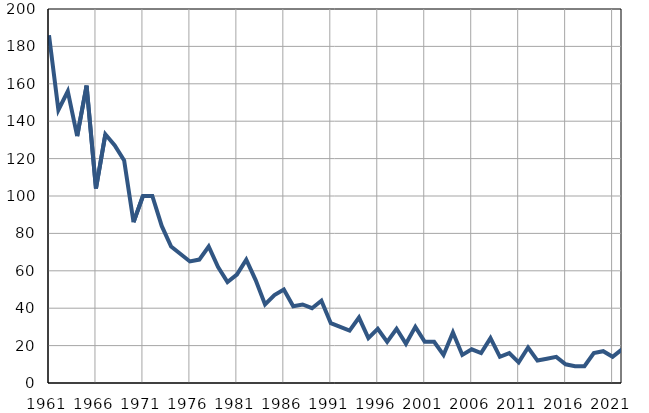
| Category | Умрла 
одојчад |
|---|---|
| 1961.0 | 186 |
| 1962.0 | 146 |
| 1963.0 | 156 |
| 1964.0 | 132 |
| 1965.0 | 159 |
| 1966.0 | 104 |
| 1967.0 | 133 |
| 1968.0 | 127 |
| 1969.0 | 119 |
| 1970.0 | 86 |
| 1971.0 | 100 |
| 1972.0 | 100 |
| 1973.0 | 84 |
| 1974.0 | 73 |
| 1975.0 | 69 |
| 1976.0 | 65 |
| 1977.0 | 66 |
| 1978.0 | 73 |
| 1979.0 | 62 |
| 1980.0 | 54 |
| 1981.0 | 58 |
| 1982.0 | 66 |
| 1983.0 | 55 |
| 1984.0 | 42 |
| 1985.0 | 47 |
| 1986.0 | 50 |
| 1987.0 | 41 |
| 1988.0 | 42 |
| 1989.0 | 40 |
| 1990.0 | 44 |
| 1991.0 | 32 |
| 1992.0 | 30 |
| 1993.0 | 28 |
| 1994.0 | 35 |
| 1995.0 | 24 |
| 1996.0 | 29 |
| 1997.0 | 22 |
| 1998.0 | 29 |
| 1999.0 | 21 |
| 2000.0 | 30 |
| 2001.0 | 22 |
| 2002.0 | 22 |
| 2003.0 | 15 |
| 2004.0 | 27 |
| 2005.0 | 15 |
| 2006.0 | 18 |
| 2007.0 | 16 |
| 2008.0 | 24 |
| 2009.0 | 14 |
| 2010.0 | 16 |
| 2011.0 | 11 |
| 2012.0 | 19 |
| 2013.0 | 12 |
| 2014.0 | 13 |
| 2015.0 | 14 |
| 2016.0 | 10 |
| 2017.0 | 9 |
| 2018.0 | 9 |
| 2019.0 | 16 |
| 2020.0 | 17 |
| 2021.0 | 14 |
| 2022.0 | 18 |